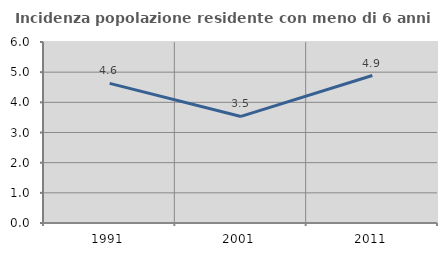
| Category | Incidenza popolazione residente con meno di 6 anni |
|---|---|
| 1991.0 | 4.628 |
| 2001.0 | 3.532 |
| 2011.0 | 4.889 |